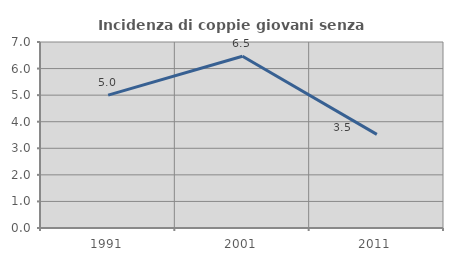
| Category | Incidenza di coppie giovani senza figli |
|---|---|
| 1991.0 | 5 |
| 2001.0 | 6.463 |
| 2011.0 | 3.522 |